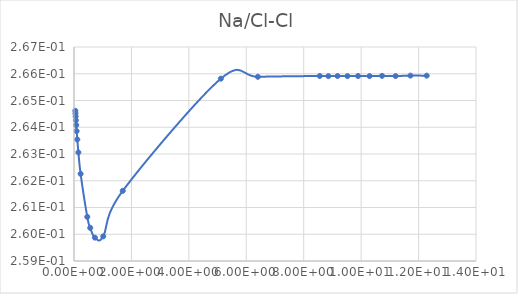
| Category | Series 0 |
|---|---|
| 0.045806 | 0.265 |
| 0.050896 | 0.265 |
| 0.057272 | 0.264 |
| 0.065473 | 0.264 |
| 0.076393 | 0.264 |
| 0.091717 | 0.264 |
| 0.11468 | 0.264 |
| 0.15308 | 0.263 |
| 0.22991 | 0.262 |
| 0.46246 | 0.261 |
| 0.56529 | 0.26 |
| 0.72693 | 0.26 |
| 1.018 | 0.26 |
| 1.6979 | 0.262 |
| 5.1148 | 0.266 |
| 6.4035 | 0.266 |
| 8.5602 | 0.266 |
| 8.8586 | 0.266 |
| 9.1785 | 0.266 |
| 9.5223 | 0.266 |
| 9.893 | 0.266 |
| 10.294 | 0.266 |
| 10.728 | 0.266 |
| 11.201 | 0.266 |
| 11.717 | 0.266 |
| 12.283 | 0.266 |